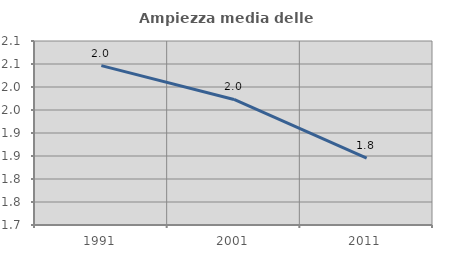
| Category | Ampiezza media delle famiglie |
|---|---|
| 1991.0 | 2.047 |
| 2001.0 | 1.973 |
| 2011.0 | 1.845 |